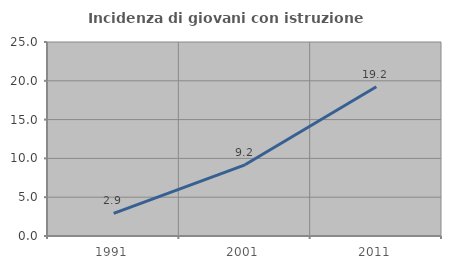
| Category | Incidenza di giovani con istruzione universitaria |
|---|---|
| 1991.0 | 2.907 |
| 2001.0 | 9.177 |
| 2011.0 | 19.231 |